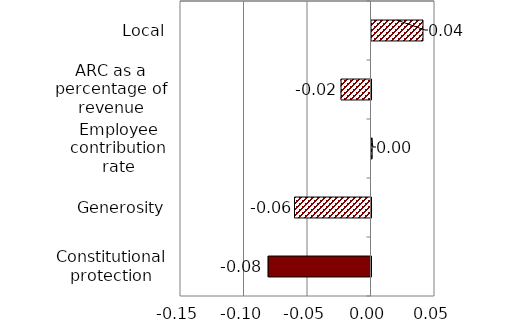
| Category | Series 0 |
|---|---|
| Local | 0.041 |
| ARC as a percentage of revenue | -0.024 |
| Employee contribution rate | 0.001 |
| Generosity | -0.06 |
| Constitutional protection | -0.081 |